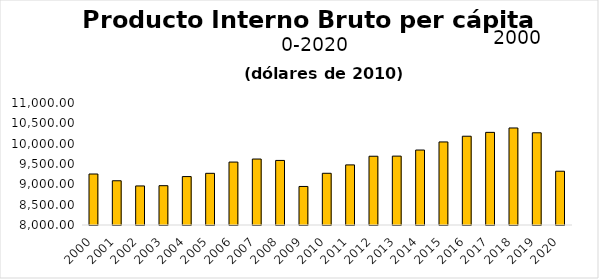
| Category | US$ |
|---|---|
| 2000.0 | 9253.968 |
| 2001.0 | 9088.053 |
| 2002.0 | 8960.554 |
| 2003.0 | 8967.029 |
| 2004.0 | 9190.741 |
| 2005.0 | 9270.657 |
| 2006.0 | 9547.333 |
| 2007.0 | 9622.048 |
| 2008.0 | 9587.636 |
| 2009.0 | 8947.742 |
| 2010.0 | 9271.398 |
| 2011.0 | 9477.888 |
| 2012.0 | 9690.869 |
| 2013.0 | 9693.723 |
| 2014.0 | 9843.398 |
| 2015.0 | 10042.14 |
| 2016.0 | 10183.033 |
| 2017.0 | 10277.883 |
| 2018.0 | 10385.833 |
| 2019.0 | 10267.5 |
| 2020.0 | 9322.336 |